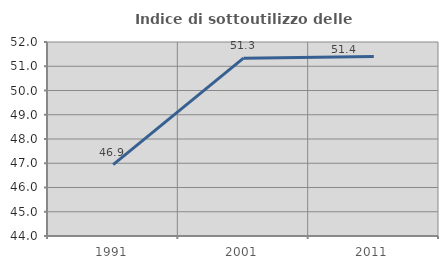
| Category | Indice di sottoutilizzo delle abitazioni  |
|---|---|
| 1991.0 | 46.943 |
| 2001.0 | 51.333 |
| 2011.0 | 51.402 |